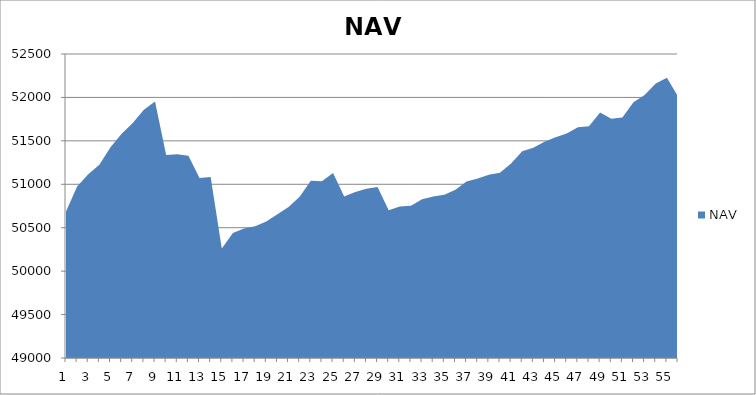
| Category | NAV |
|---|---|
| 0 | 50687.913 |
| 1 | 50975.413 |
| 2 | 51115.874 |
| 3 | 51223.542 |
| 4 | 51427.364 |
| 5 | 51580.567 |
| 6 | 51704.692 |
| 7 | 51858.016 |
| 8 | 51951.766 |
| 9 | 51336.067 |
| 10 | 51345.356 |
| 11 | 51328.667 |
| 12 | 51072.985 |
| 13 | 51085.199 |
| 14 | 50261.67 |
| 15 | 50438.394 |
| 16 | 50489.896 |
| 17 | 50518.251 |
| 18 | 50572.468 |
| 19 | 50655.55 |
| 20 | 50737.787 |
| 21 | 50856.035 |
| 22 | 51041.806 |
| 23 | 51034.925 |
| 24 | 51128.589 |
| 25 | 50859.456 |
| 26 | 50911.137 |
| 27 | 50950.007 |
| 28 | 50970.175 |
| 29 | 50701.326 |
| 30 | 50743.495 |
| 31 | 50751.546 |
| 32 | 50826.725 |
| 33 | 50860.533 |
| 34 | 50879.283 |
| 35 | 50936.644 |
| 36 | 51031.381 |
| 37 | 51065.306 |
| 38 | 51109.987 |
| 39 | 51132.251 |
| 40 | 51238.242 |
| 41 | 51380.786 |
| 42 | 51420.042 |
| 43 | 51490.787 |
| 44 | 51541.14 |
| 45 | 51584.924 |
| 46 | 51657.998 |
| 47 | 51667.348 |
| 48 | 51825.763 |
| 49 | 51755.412 |
| 50 | 51767.57 |
| 51 | 51945.15 |
| 52 | 52028.391 |
| 53 | 52160.744 |
| 54 | 52227.009 |
| 55 | 52009.927 |